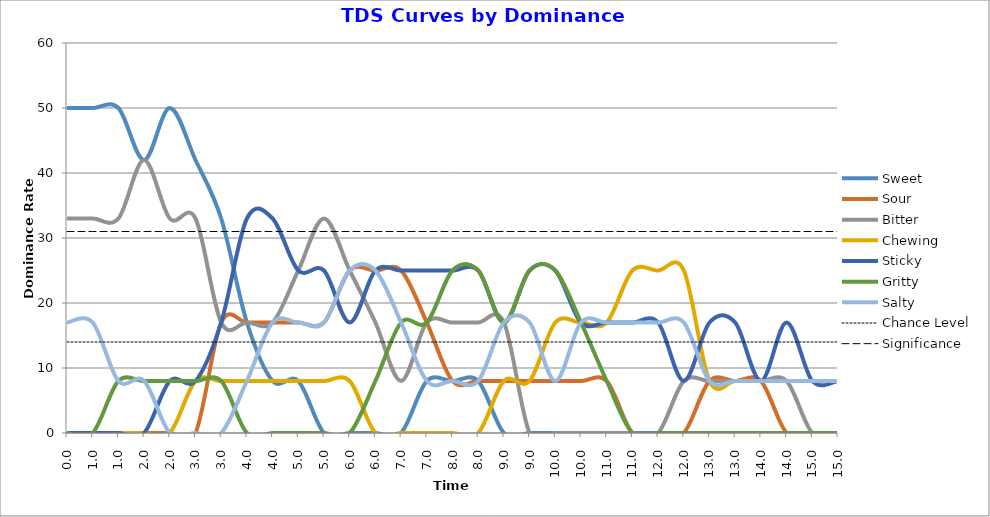
| Category | Sweet | Sour | Bitter | Chewing | Sticky | Gritty | Salty | Chance Level | Significance |
|---|---|---|---|---|---|---|---|---|---|
| 0.0 | 50 | 0 | 33 | 0 | 0 | 0 | 17 | 14 | 31 |
| 1.0 | 50 | 0 | 33 | 0 | 0 | 0 | 17 | 14 | 31 |
| 1.0 | 50 | 0 | 33 | 0 | 0 | 8 | 8 | 14 | 31 |
| 2.0 | 42 | 0 | 42 | 0 | 0 | 8 | 8 | 14 | 31 |
| 2.0 | 50 | 0 | 33 | 0 | 8 | 8 | 0 | 14 | 31 |
| 3.0 | 42 | 0 | 33 | 8 | 8 | 8 | 0 | 14 | 31 |
| 3.0 | 33 | 17 | 17 | 8 | 17 | 8 | 0 | 14 | 31 |
| 4.0 | 17 | 17 | 17 | 8 | 33 | 0 | 8 | 14 | 31 |
| 4.0 | 8 | 17 | 17 | 8 | 33 | 0 | 17 | 14 | 31 |
| 5.0 | 8 | 17 | 25 | 8 | 25 | 0 | 17 | 14 | 31 |
| 5.0 | 0 | 17 | 33 | 8 | 25 | 0 | 17 | 14 | 31 |
| 6.0 | 0 | 25 | 25 | 8 | 17 | 0 | 25 | 14 | 31 |
| 6.0 | 0 | 25 | 17 | 0 | 25 | 8 | 25 | 14 | 31 |
| 7.0 | 0 | 25 | 8 | 0 | 25 | 17 | 17 | 14 | 31 |
| 7.0 | 8 | 17 | 17 | 0 | 25 | 17 | 8 | 14 | 31 |
| 8.0 | 8 | 8 | 17 | 0 | 25 | 25 | 8 | 14 | 31 |
| 8.0 | 8 | 8 | 17 | 0 | 25 | 25 | 8 | 14 | 31 |
| 9.0 | 0 | 8 | 17 | 8 | 17 | 17 | 17 | 14 | 31 |
| 9.0 | 0 | 8 | 0 | 8 | 25 | 25 | 17 | 14 | 31 |
| 10.0 | 0 | 8 | 0 | 17 | 25 | 25 | 8 | 14 | 31 |
| 10.0 | 0 | 8 | 0 | 17 | 17 | 17 | 17 | 14 | 31 |
| 11.0 | 0 | 8 | 0 | 17 | 17 | 8 | 17 | 14 | 31 |
| 11.0 | 0 | 0 | 0 | 25 | 17 | 0 | 17 | 14 | 31 |
| 12.0 | 0 | 0 | 0 | 25 | 17 | 0 | 17 | 14 | 31 |
| 12.0 | 0 | 0 | 8 | 25 | 8 | 0 | 17 | 14 | 31 |
| 13.0 | 0 | 8 | 8 | 8 | 17 | 0 | 8 | 14 | 31 |
| 13.0 | 0 | 8 | 8 | 8 | 17 | 0 | 8 | 14 | 31 |
| 14.0 | 0 | 8 | 8 | 8 | 8 | 0 | 8 | 14 | 31 |
| 14.0 | 0 | 0 | 8 | 8 | 17 | 0 | 8 | 14 | 31 |
| 15.0 | 0 | 0 | 0 | 8 | 8 | 0 | 8 | 14 | 31 |
| 15.0 | 0 | 0 | 0 | 8 | 8 | 0 | 8 | 14 | 31 |